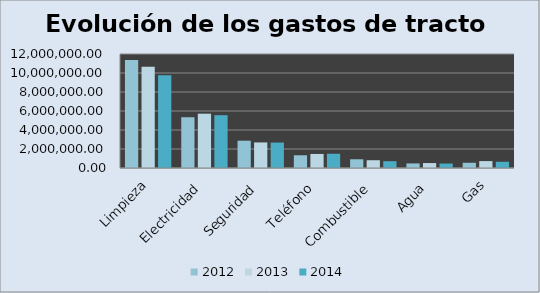
| Category | Series 0 | Series 1 | 2012 | 2013 | 2014 |
|---|---|---|---|---|---|
| Limpieza |  |  | 11376013.49 | 10670231.78 | 9763423.91 |
| Electricidad |  |  | 5344093.24 | 5717816.03 | 5558877.72 |
| Seguridad |  |  | 2874879.15 | 2692955.56 | 2676149.46 |
| Teléfono |  |  | 1341481.37 | 1477255.81 | 1499929.02 |
| Combustible |  |  | 916994.02 | 818822.05 | 715218.99 |
| Agua |  |  | 481542.49 | 521464.47 | 469020.08 |
| Gas |  |  | 550637.36 | 727129.1 | 653634.1 |